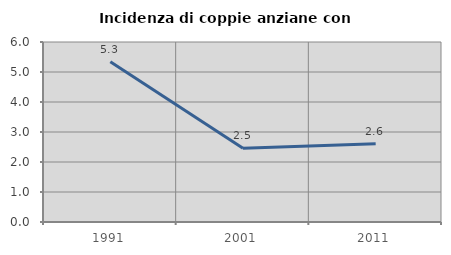
| Category | Incidenza di coppie anziane con figli |
|---|---|
| 1991.0 | 5.344 |
| 2001.0 | 2.459 |
| 2011.0 | 2.609 |